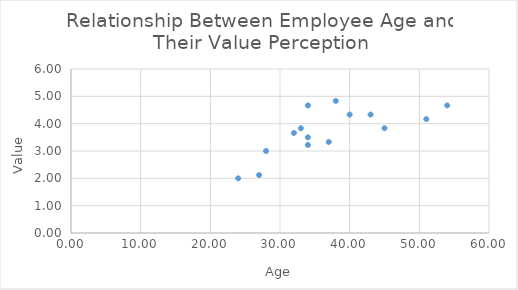
| Category | Value |
|---|---|
| 27.0 | 2.12 |
| 33.0 | 3.833 |
| 28.0 | 3 |
| 45.0 | 3.833 |
| 34.0 | 4.667 |
| 51.0 | 4.167 |
| 43.0 | 4.333 |
| 24.0 | 2 |
| 34.0 | 3.22 |
| 54.0 | 4.667 |
| 34.0 | 3.5 |
| 38.0 | 4.833 |
| 40.0 | 4.333 |
| 37.0 | 3.33 |
| 32.0 | 3.66 |